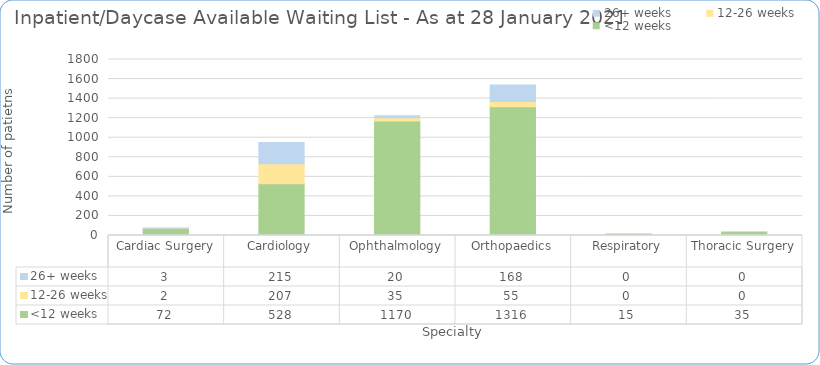
| Category | <12 weeks | 12-26 weeks | 26+ weeks |
|---|---|---|---|
| Cardiac Surgery | 72 | 2 | 3 |
| Cardiology | 528 | 207 | 215 |
| Ophthalmology | 1170 | 35 | 20 |
| Orthopaedics | 1316 | 55 | 168 |
| Respiratory | 15 | 0 | 0 |
| Thoracic Surgery | 35 | 0 | 0 |